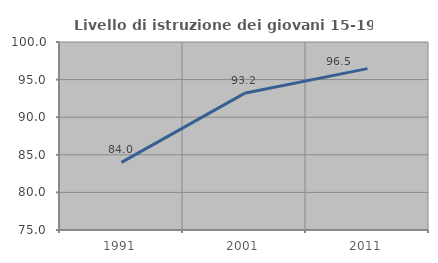
| Category | Livello di istruzione dei giovani 15-19 anni |
|---|---|
| 1991.0 | 83.987 |
| 2001.0 | 93.173 |
| 2011.0 | 96.457 |